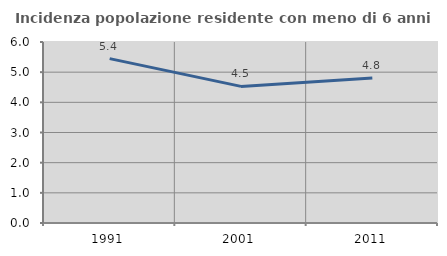
| Category | Incidenza popolazione residente con meno di 6 anni |
|---|---|
| 1991.0 | 5.448 |
| 2001.0 | 4.528 |
| 2011.0 | 4.809 |